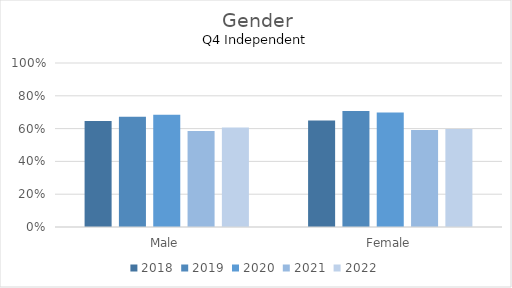
| Category | 2018 | 2019 | 2020 | 2021 | 2022 |
|---|---|---|---|---|---|
| Male | 0.646 | 0.673 | 0.684 | 0.586 | 0.607 |
| Female | 0.65 | 0.707 | 0.698 | 0.591 | 0.597 |